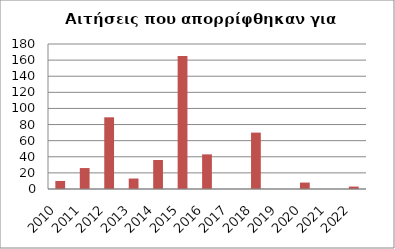
| Category | Series 1 |
|---|---|
| 2010.0 | 10 |
| 2011.0 | 26 |
| 2012.0 | 89 |
| 2013.0 | 13 |
| 2014.0 | 36 |
| 2015.0 | 165 |
| 2016.0 | 43 |
| 2017.0 | 0 |
| 2018.0 | 70 |
| 2019.0 | 0 |
| 2020.0 | 8 |
| 2021.0 | 0 |
| 2022.0 | 3 |